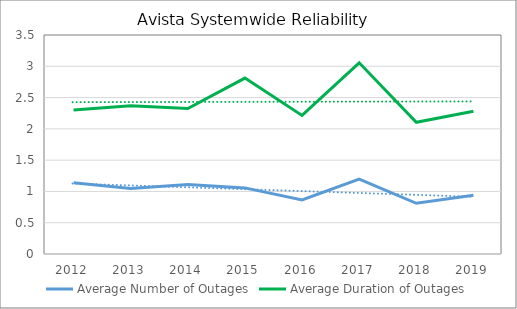
| Category | Average Number of Outages | Average Duration of Outages |
|---|---|---|
| 2012.0 | 1.14 | 2.3 |
| 2013.0 | 1.048 | 2.368 |
| 2014.0 | 1.112 | 2.325 |
| 2015.0 | 1.057 | 2.811 |
| 2016.0 | 0.863 | 2.215 |
| 2017.0 | 1.198 | 3.056 |
| 2018.0 | 0.81 | 2.105 |
| 2019.0 | 0.94 | 2.28 |